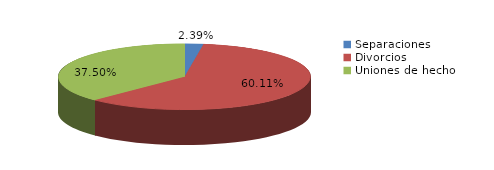
| Category | Series 0 |
|---|---|
| Separaciones | 98 |
| Divorcios | 2464 |
| Uniones de hecho | 1537 |